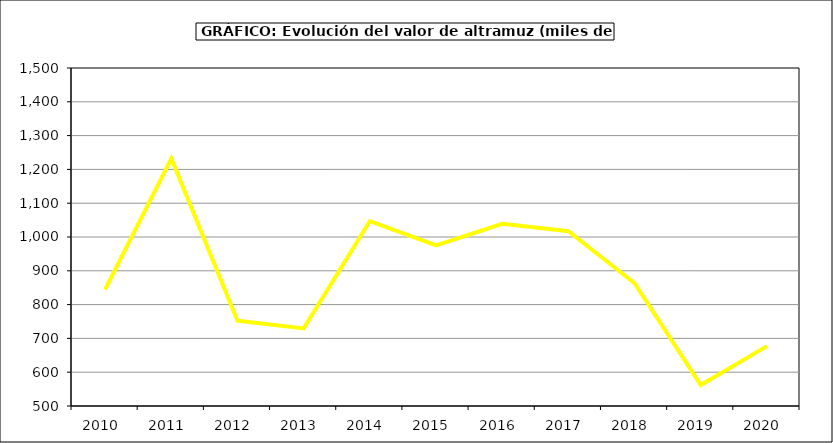
| Category | Valor |
|---|---|
| 2010.0 | 845.15 |
| 2011.0 | 1232.091 |
| 2012.0 | 752.557 |
| 2013.0 | 729.577 |
| 2014.0 | 1047.124 |
| 2015.0 | 975 |
| 2016.0 | 1039 |
| 2017.0 | 1016.9 |
| 2018.0 | 863.103 |
| 2019.0 | 561.855 |
| 2020.0 | 677.092 |